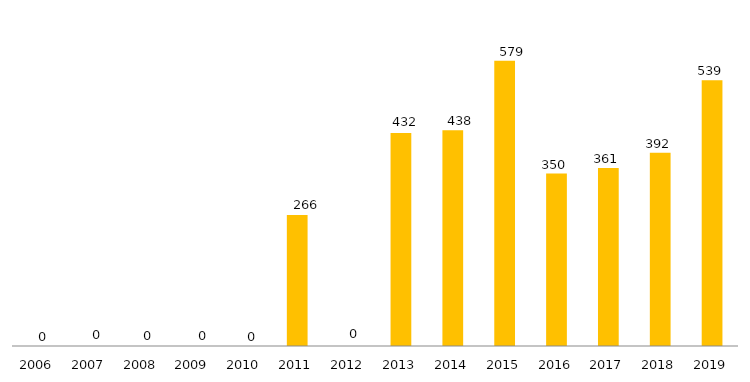
| Category | Andamento* |
|---|---|
| 2006.0 | 0 |
| 2007.0 | 0 |
| 2008.0 | 0 |
| 2009.0 | 0 |
| 2010.0 | 0 |
| 2011.0 | 266 |
| 2012.0 | 0 |
| 2013.0 | 432 |
| 2014.0 | 438 |
| 2015.0 | 579 |
| 2016.0 | 350 |
| 2017.0 | 361 |
| 2018.0 | 392 |
| 2019.0 | 539 |